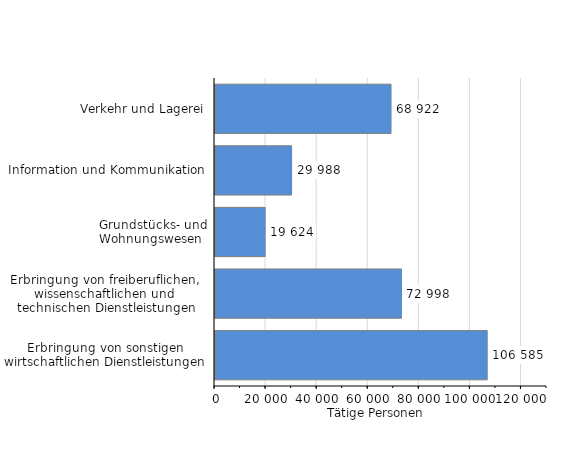
| Category | Tätige Personen |
|---|---|
| Verkehr und Lagerei | 68922 |
| Information und Kommunikation | 29988 |
| Grundstücks- und Wohnungswesen  | 19624 |
| Erbringung von freiberuflichen, 
wissenschaftlichen und 
technischen Dienstleistungen | 72998 |
| Erbringung von sonstigen wirtschaftlichen Dienstleistungen | 106585 |